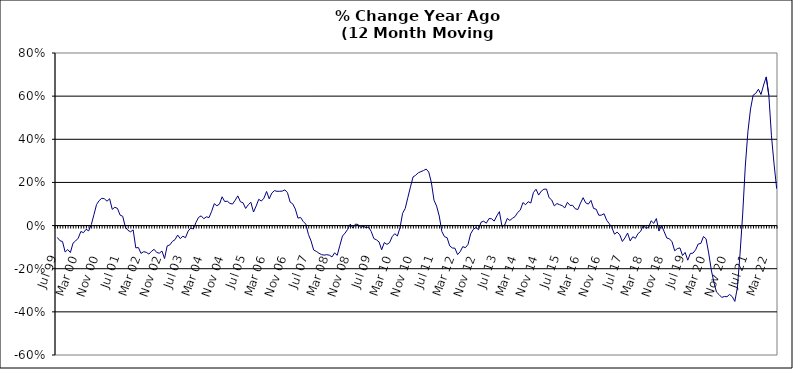
| Category | Series 0 |
|---|---|
| Jul 99 | -0.055 |
| Aug 99 | -0.07 |
| Sep 99 | -0.074 |
| Oct 99 | -0.123 |
| Nov 99 | -0.111 |
| Dec 99 | -0.125 |
| Jan 00 | -0.082 |
| Feb 00 | -0.071 |
| Mar 00 | -0.058 |
| Apr 00 | -0.027 |
| May 00 | -0.033 |
| Jun 00 | -0.017 |
| Jul 00 | -0.025 |
| Aug 00 | 0.005 |
| Sep 00 | 0.05 |
| Oct 00 | 0.098 |
| Nov 00 | 0.116 |
| Dec 00 | 0.127 |
| Jan 01 | 0.124 |
| Feb 01 | 0.113 |
| Mar 01 | 0.124 |
| Apr 01 | 0.075 |
| May 01 | 0.085 |
| Jun 01 | 0.08 |
| Jul 01 | 0.048 |
| Aug 01 | 0.043 |
| Sep 01 | -0.007 |
| Oct 01 | -0.022 |
| Nov 01 | -0.029 |
| Dec 01 | -0.02 |
| Jan 02 | -0.103 |
| Feb 02 | -0.102 |
| Mar 02 | -0.129 |
| Apr 02 | -0.121 |
| May 02 | -0.124 |
| Jun 02 | -0.132 |
| Jul 02 | -0.119 |
| Aug 02 | -0.11 |
| Sep 02 | -0.125 |
| Oct 02 | -0.128 |
| Nov 02 | -0.118 |
| Dec 02 | -0.153 |
| Jan 03 | -0.094 |
| Feb 03 | -0.09 |
| Mar 03 | -0.073 |
| Apr 03 | -0.065 |
| May 03 | -0.044 |
| Jun 03 | -0.06 |
| Jul 03 | -0.049 |
| Aug 03 | -0.056 |
| Sep 03 | -0.026 |
| Oct 03 | -0.012 |
| Nov 03 | -0.016 |
| Dec 03 | 0.014 |
| Jan 04 | 0.038 |
| Feb 04 | 0.045 |
| Mar 04 | 0.032 |
| Apr 04 | 0.041 |
| May 04 | 0.037 |
| Jun 04 | 0.066 |
| Jul 04 | 0.101 |
| Aug 04 | 0.092 |
| Sep 04 | 0.1 |
| Oct 04 | 0.133 |
| Nov 04 | 0.111 |
| Dec 04 | 0.113 |
| Jan 05 | 0.103 |
| Feb 05 | 0.1 |
| Mar 05 | 0.118 |
| Apr 05 | 0.138 |
| May 05 | 0.11 |
| Jun 05 | 0.106 |
| Jul 05 | 0.079 |
| Aug 05 | 0.097 |
| Sep 05 | 0.108 |
| Oct 05 | 0.063 |
| Nov 05 | 0.09 |
| Dec 05 | 0.122 |
| Jan 06 | 0.114 |
| Feb 06 | 0.127 |
| Mar 06 | 0.158 |
| Apr 06 | 0.124 |
| May 06 | 0.151 |
| Jun 06 | 0.162 |
| Jul 06 | 0.159 |
| Aug 06 | 0.159 |
| Sep 06 | 0.16 |
| Oct 06 | 0.166 |
| Nov 06 | 0.152 |
| Dec 06 | 0.109 |
| Jan 07 | 0.101 |
| Feb 07 | 0.076 |
| Mar 07 | 0.034 |
| Apr 07 | 0.038 |
| May 07 | 0.019 |
| Jun 07 | 0.007 |
| Jul 07 | -0.041 |
| Aug 07 | -0.071 |
| Sep 07 | -0.113 |
| Oct 07 | -0.12 |
| Nov 07 | -0.128 |
| Dec 07 | -0.135 |
| Jan 08 | -0.137 |
| Feb 08 | -0.135 |
| Mar 08 | -0.137 |
| Apr 08 | -0.145 |
| May 08 | -0.126 |
| Jun 08 | -0.138 |
| Jul 08 | -0.093 |
| Aug 08 | -0.049 |
| Sep-08 | -0.035 |
| Oct 08 | -0.018 |
| Nov 08 | 0.007 |
| Dec 08 | -0.011 |
| Jan 09 | 0.007 |
| Feb 09 | 0.005 |
| Mar 09 | -0.009 |
| Apr 09 | -0.003 |
| May 09 | -0.01 |
| Jun 09 | -0.007 |
| Jul 09 | -0.027 |
| Aug 09 | -0.06 |
| Sep 09 | -0.066 |
| Oct 09 | -0.076 |
| Nov 09 | -0.112 |
| Dec 09 | -0.079 |
| Jan 10 | -0.087 |
| Feb 10 | -0.079 |
| Mar 10 | -0.052 |
| Apr 10 | -0.037 |
| May 10 | -0.048 |
| Jun 10 | -0.01 |
| Jul 10 | 0.057 |
| Aug 10 | 0.08 |
| Sep 10 | 0.13 |
| Oct 10 | 0.179 |
| Nov 10 | 0.226 |
| Dec 10 | 0.233 |
| Jan 11 | 0.245 |
| Feb 11 | 0.25 |
| Mar 11 | 0.255 |
| Apr 11 | 0.262 |
| May 11 | 0.248 |
| Jun 11 | 0.199 |
| Jul 11 | 0.118 |
| Aug 11 | 0.09 |
| Sep 11 | 0.044 |
| Oct 11 | -0.028 |
| Nov 11 | -0.051 |
| Dec 11 | -0.056 |
| Jan 12 | -0.094 |
| Feb 12 | -0.104 |
| Mar 12 | -0.105 |
| Apr 12 | -0.134 |
| May 12 | -0.121 |
| Jun 12 | -0.098 |
| Jul 12 | -0.103 |
| Aug 12 | -0.087 |
| Sep 12 | -0.038 |
| Oct 12 | -0.018 |
| Nov 12 | -0.009 |
| Dec 12 | -0.019 |
| Jan 13 | 0.016 |
| Feb-13 | 0.02 |
| Mar-13 | 0.011 |
| Apr 13 | 0.032 |
| May 13 | 0.032 |
| Jun-13 | 0.021 |
| Jul 13 | 0.045 |
| Aug 13 | 0.065 |
| Sep 13 | -0.005 |
| Oct 13 | 0.002 |
| Nov 13 | 0.033 |
| Dec 13 | 0.024 |
| Jan 14 | 0.034 |
| Feb-14 | 0.042 |
| Mar 14 | 0.061 |
| Apr 14 | 0.072 |
| May 14 | 0.107 |
| Jun 14 | 0.097 |
| Jul-14 | 0.111 |
| Aug-14 | 0.105 |
| Sep 14 | 0.153 |
| Oct 14 | 0.169 |
| Nov 14 | 0.141 |
| Dec 14 | 0.159 |
| Jan 15 | 0.169 |
| Feb 15 | 0.169 |
| Mar 15 | 0.129 |
| Apr-15 | 0.118 |
| May 15 | 0.091 |
| Jun-15 | 0.102 |
| Jul 15 | 0.097 |
| Aug 15 | 0.092 |
| Sep 15 | 0.082 |
| Oct 15 | 0.108 |
| Nov 15 | 0.093 |
| Dec 15 | 0.094 |
| Jan 16 | 0.078 |
| Feb 16 | 0.075 |
| Mar 16 | 0.104 |
| Apr 16 | 0.129 |
| May 16 | 0.105 |
| Jun 16 | 0.1 |
| Jul 16 | 0.117 |
| Aug 16 | 0.08 |
| Sep 16 | 0.076 |
| Oct 16 | 0.048 |
| Nov 16 | 0.048 |
| Dec 16 | 0.055 |
| Jan 17 | 0.025 |
| Feb 17 | 0.009 |
| Mar 17 | -0.01 |
| Apr 17 | -0.04 |
| May 17 | -0.031 |
| Jun 17 | -0.042 |
| Jul 17 | -0.074 |
| Aug 17 | -0.057 |
| Sep 17 | -0.035 |
| Oct 17 | -0.071 |
| Nov 17 | -0.052 |
| Dec 17 | -0.059 |
| Jan 18 | -0.037 |
| Feb 18 | -0.027 |
| Mar 18 | 0 |
| Apr 18 | -0.012 |
| May 18 | -0.009 |
| Jun 18 | 0.022 |
| Jul 18 | 0.01 |
| Aug 18 | 0.033 |
| Sep 18 | -0.025 |
| Oct 18 | 0.002 |
| Nov 18 | -0.029 |
| Dec 18 | -0.058 |
| Jan 19 | -0.061 |
| Feb 19 | -0.075 |
| Mar 19 | -0.117 |
| Apr 19 | -0.107 |
| May 19 | -0.104 |
| Jun 19 | -0.139 |
| Jul 19 | -0.124 |
| Aug 19 | -0.16 |
| Sep 19 | -0.129 |
| Oct 19 | -0.128 |
| Nov 19 | -0.112 |
| Dec 19 | -0.085 |
| Jan 20 | -0.083 |
| Feb 20 | -0.051 |
| Mar 20 | -0.061 |
| Apr 20 | -0.127 |
| May 20 | -0.206 |
| Jun 20 | -0.264 |
| Jul 20 | -0.308 |
| Aug 20 | -0.32 |
| Sep 20 | -0.333 |
| Oct 20 | -0.329 |
| Nov 20 | -0.33 |
| Dec 20 | -0.319 |
| Jan 21 | -0.329 |
| Feb 21 | -0.352 |
| Mar 21 | -0.286 |
| Apr 21 | -0.129 |
| May 21 | 0.053 |
| Jun 21 | 0.276 |
| Jul 21 | 0.435 |
| Aug 21 | 0.541 |
| Sep 21 | 0.604 |
| Oct 21 | 0.613 |
| Nov 21 | 0.632 |
| Dec 21 | 0.608 |
| Jan 22 | 0.652 |
| Feb 22 | 0.689 |
| Mar 22 | 0.603 |
| Apr 22 | 0.416 |
| May 22 | 0.285 |
| Jun 22 | 0.171 |